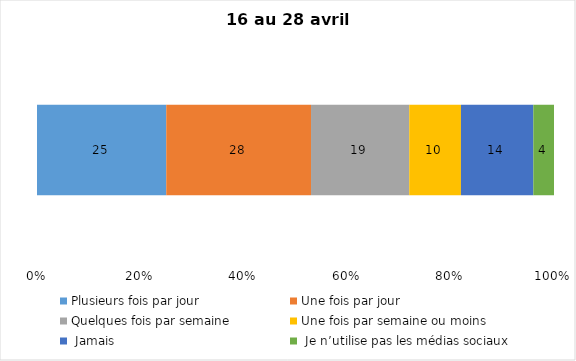
| Category | Plusieurs fois par jour | Une fois par jour | Quelques fois par semaine   | Une fois par semaine ou moins   |  Jamais   |  Je n’utilise pas les médias sociaux |
|---|---|---|---|---|---|---|
| 0 | 25 | 28 | 19 | 10 | 14 | 4 |